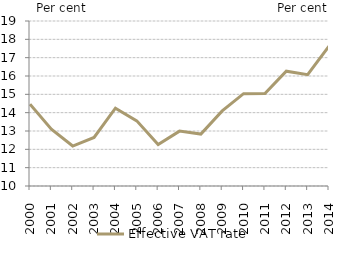
| Category | Effective VAT rate |
|---|---|
| 2000.0 | 14.46 |
| 2001.0 | 13.1 |
| 2002.0 | 12.18 |
| 2003.0 | 12.651 |
| 2004.0 | 14.242 |
| 2005.0 | 13.553 |
| 2006.0 | 12.26 |
| 2007.0 | 12.993 |
| 2008.0 | 12.831 |
| 2009.0 | 14.099 |
| 2010.0 | 15.038 |
| 2011.0 | 15.046 |
| 2012.0 | 16.26 |
| 2013.0 | 16.07 |
| 2014.0 | 17.626 |